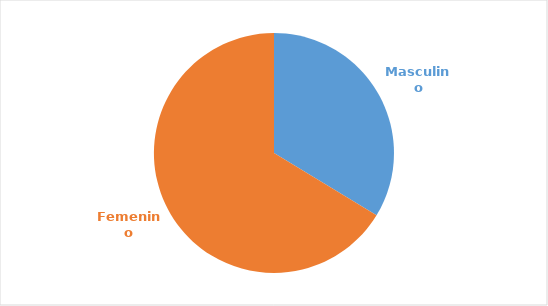
| Category | Series 0 |
|---|---|
| Masculino | 0.337 |
| Femenino | 0.663 |